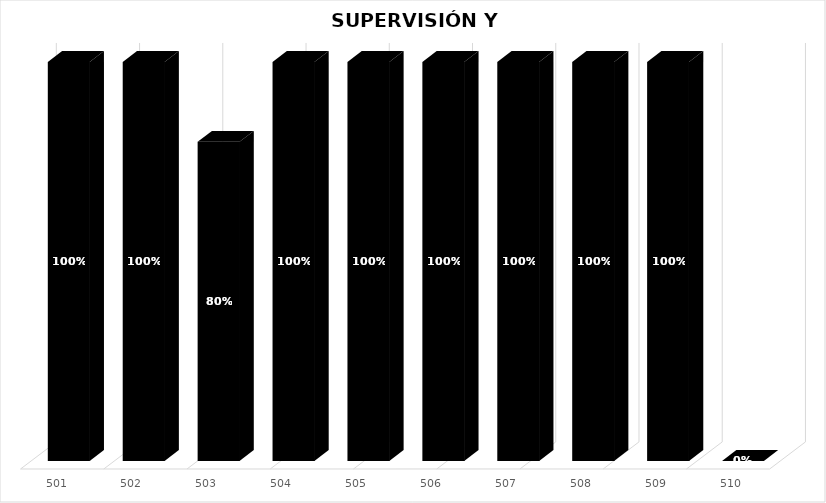
| Category | % Avance |
|---|---|
| 501.0 | 1 |
| 502.0 | 1 |
| 503.0 | 0.8 |
| 504.0 | 1 |
| 505.0 | 1 |
| 506.0 | 1 |
| 507.0 | 1 |
| 508.0 | 1 |
| 509.0 | 1 |
| 510.0 | 0 |